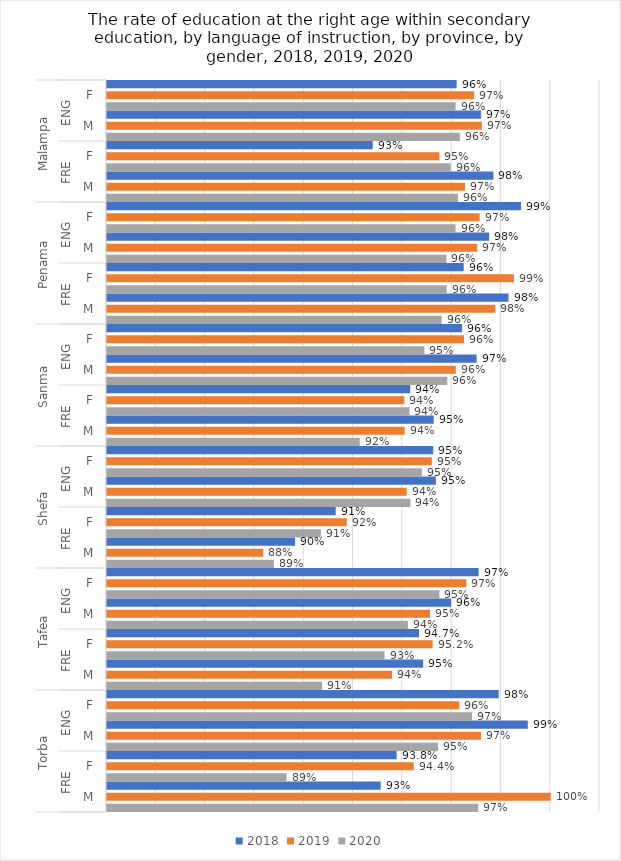
| Category | 2018 | 2019 | 2020 |
|---|---|---|---|
| 0 | 0.962 | 0.969 | 0.961 |
| 1 | 0.972 | 0.972 | 0.963 |
| 2 | 0.928 | 0.955 | 0.959 |
| 3 | 0.977 | 0.965 | 0.962 |
| 4 | 0.988 | 0.971 | 0.961 |
| 5 | 0.975 | 0.97 | 0.958 |
| 6 | 0.965 | 0.985 | 0.958 |
| 7 | 0.983 | 0.978 | 0.956 |
| 8 | 0.964 | 0.965 | 0.949 |
| 9 | 0.97 | 0.961 | 0.958 |
| 10 | 0.943 | 0.941 | 0.943 |
| 11 | 0.953 | 0.941 | 0.923 |
| 12 | 0.952 | 0.952 | 0.948 |
| 13 | 0.953 | 0.942 | 0.943 |
| 14 | 0.913 | 0.917 | 0.907 |
| 15 | 0.896 | 0.883 | 0.888 |
| 16 | 0.971 | 0.966 | 0.955 |
| 17 | 0.96 | 0.951 | 0.942 |
| 18 | 0.947 | 0.952 | 0.933 |
| 19 | 0.948 | 0.936 | 0.907 |
| 20 | 0.979 | 0.963 | 0.968 |
| 21 | 0.991 | 0.972 | 0.954 |
| 22 | 0.938 | 0.944 | 0.893 |
| 23 | 0.931 | 1 | 0.971 |